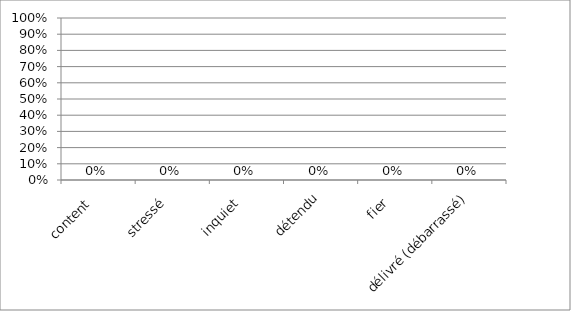
| Category | Series 0 |
|---|---|
| content  | 0 |
| stressé  | 0 |
| inquiet  | 0 |
| détendu | 0 |
| fier  | 0 |
| délivré (débarrassé) | 0 |